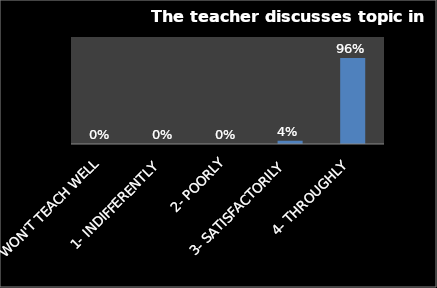
| Category | Series 0 |
|---|---|
| 0- WON'T TEACH WELL | 0 |
| 1- INDIFFERENTLY | 0 |
| 2- POORLY | 0 |
| 3- SATISFACTORILY | 0.037 |
| 4- THROUGHLY | 0.963 |